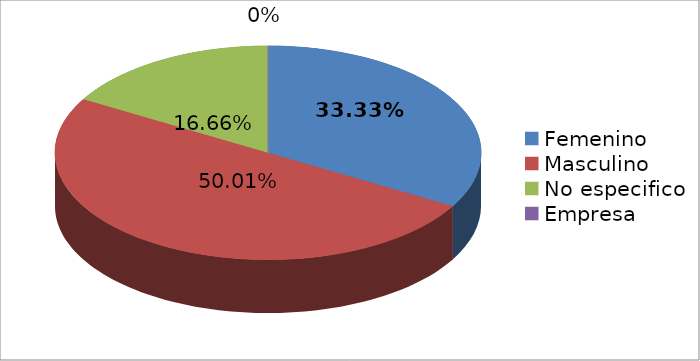
| Category | Series 0 |
|---|---|
| Femenino | 2 |
| Masculino | 3 |
| No especifico | 1 |
| Empresa | 0 |